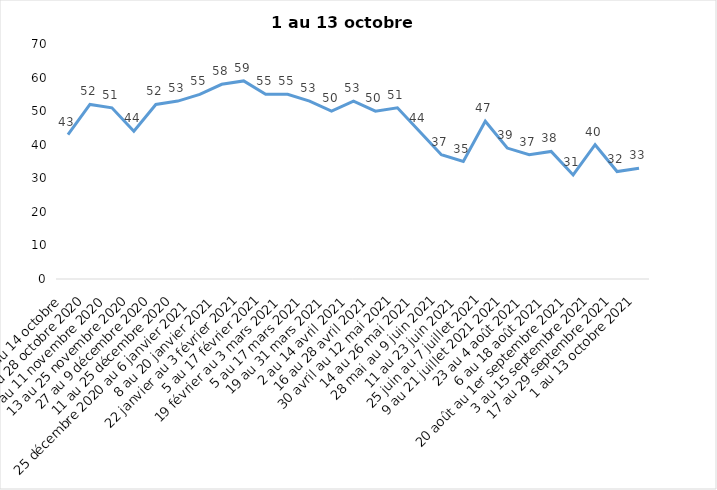
| Category | Toujours aux trois mesures |
|---|---|
| 2 au 14 octobre  | 43 |
| 16 au 28 octobre 2020 | 52 |
| 30 octobre au 11 novembre 2020 | 51 |
| 13 au 25 novembre 2020 | 44 |
| 27 au 9 décembre 2020 | 52 |
| 11 au 25 décembre 2020 | 53 |
| 25 décembre 2020 au 6 janvier 2021 | 55 |
| 8 au 20 janvier 2021 | 58 |
| 22 janvier au 3 février 2021 | 59 |
| 5 au 17 février 2021 | 55 |
| 19 février au 3 mars 2021 | 55 |
| 5 au 17 mars 2021 | 53 |
| 19 au 31 mars 2021 | 50 |
| 2 au 14 avril 2021 | 53 |
| 16 au 28 avril 2021 | 50 |
| 30 avril au 12 mai 2021 | 51 |
| 14 au 26 mai 2021 | 44 |
| 28 mai au 9 juin 2021 | 37 |
| 11 au 23 juin 2021 | 35 |
| 25 juin au 7 juillet 2021 | 47 |
| 9 au 21 juillet 2021 2021 | 39 |
| 23 au 4 août 2021 | 37 |
| 6 au 18 août 2021 | 38 |
| 20 août au 1er septembre 2021 | 31 |
| 3 au 15 septembre 2021 | 40 |
| 17 au 29 septembre 2021 | 32 |
| 1 au 13 octobre 2021 | 33 |